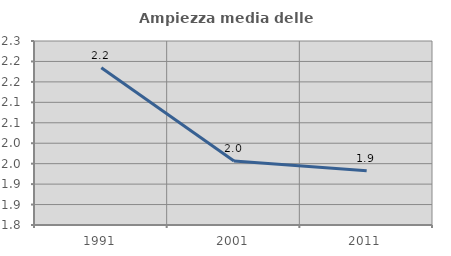
| Category | Ampiezza media delle famiglie |
|---|---|
| 1991.0 | 2.185 |
| 2001.0 | 1.957 |
| 2011.0 | 1.933 |